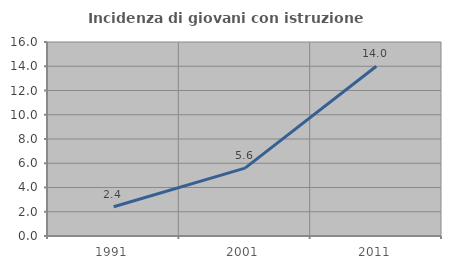
| Category | Incidenza di giovani con istruzione universitaria |
|---|---|
| 1991.0 | 2.41 |
| 2001.0 | 5.594 |
| 2011.0 | 14 |